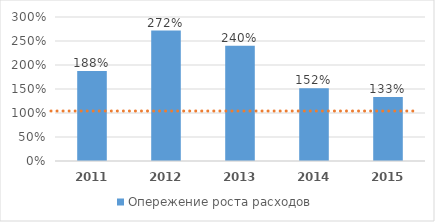
| Category | Опережение роста расходов |
|---|---|
| 2011.0 | 1.875 |
| 2012.0 | 2.717 |
| 2013.0 | 2.399 |
| 2014.0 | 1.518 |
| 2015.0 | 1.333 |